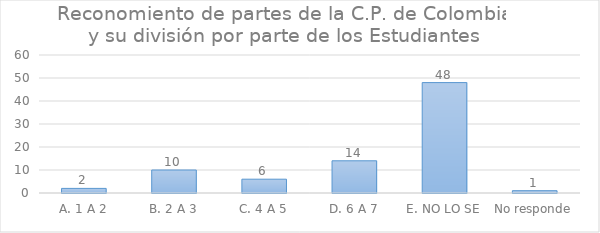
| Category | Series 0 |
|---|---|
| A. 1 A 2 | 2 |
| B. 2 A 3 | 10 |
| C. 4 A 5 | 6 |
| D. 6 A 7 | 14 |
| E. NO LO SE | 48 |
| No responde | 1 |